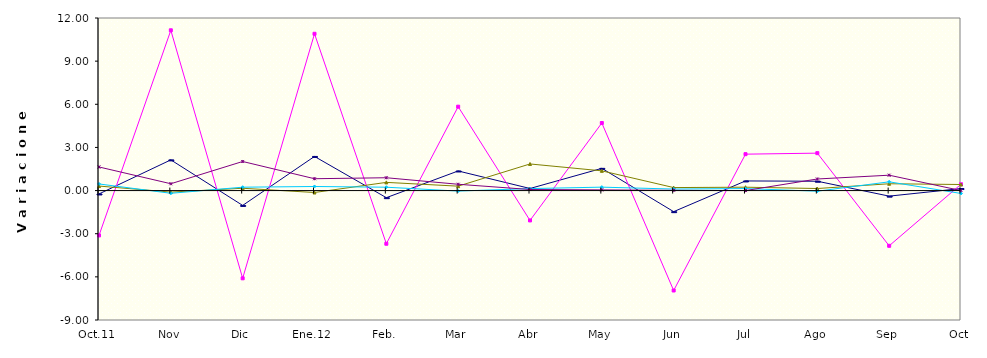
| Category | Series 0 | Series 1 | Series 2 | Series 3 | Series 4 |
|---|---|---|---|---|---|
| Oct.11 | -0.234 | -3.119 | 0.314 | 0.46 | 1.641 |
| Nov | 2.134 | 11.145 | -0.107 | -0.189 | 0.475 |
| Dic | -1.032 | -6.101 | 0.161 | 0.235 | 2.022 |
| Ene.12 | 2.373 | 10.902 | -0.135 | 0.284 | 0.823 |
| Feb. | -0.493 | -3.698 | 0.57 | 0.234 | 0.892 |
| Mar | 1.363 | 5.833 | 0.306 | -0.035 | 0.437 |
| Abr | 0.145 | -2.076 | 1.85 | 0.139 | 0.073 |
| May | 1.545 | 4.698 | 1.372 | 0.238 | 0.047 |
| Jun | -1.466 | -6.948 | 0.209 | 0.106 | 0.015 |
| Jul | 0.67 | 2.531 | 0.235 | 0.139 | 0 |
| Ago | 0.649 | 2.603 | 0.143 | -0.043 | 0.805 |
| Sep | -0.387 | -3.84 | 0.474 | 0.609 | 1.069 |
| Oct | 0.141 | 0.439 | 0.421 | -0.202 | 0 |